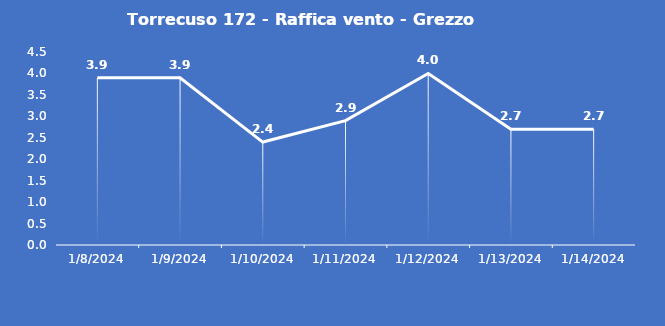
| Category | Torrecuso 172 - Raffica vento - Grezzo (m/s) |
|---|---|
| 1/8/24 | 3.9 |
| 1/9/24 | 3.9 |
| 1/10/24 | 2.4 |
| 1/11/24 | 2.9 |
| 1/12/24 | 4 |
| 1/13/24 | 2.7 |
| 1/14/24 | 2.7 |